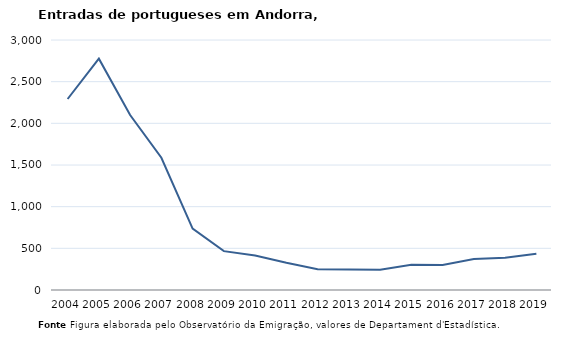
| Category | Entradas |
|---|---|
| 2004.0 | 2292 |
| 2005.0 | 2776 |
| 2006.0 | 2099 |
| 2007.0 | 1587 |
| 2008.0 | 736 |
| 2009.0 | 466 |
| 2010.0 | 415 |
| 2011.0 | 327 |
| 2012.0 | 250 |
| 2013.0 | 246 |
| 2014.0 | 244 |
| 2015.0 | 303 |
| 2016.0 | 301 |
| 2017.0 | 372 |
| 2018.0 | 386 |
| 2019.0 | 434 |